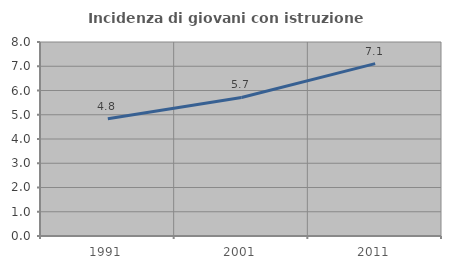
| Category | Incidenza di giovani con istruzione universitaria |
|---|---|
| 1991.0 | 4.833 |
| 2001.0 | 5.714 |
| 2011.0 | 7.107 |